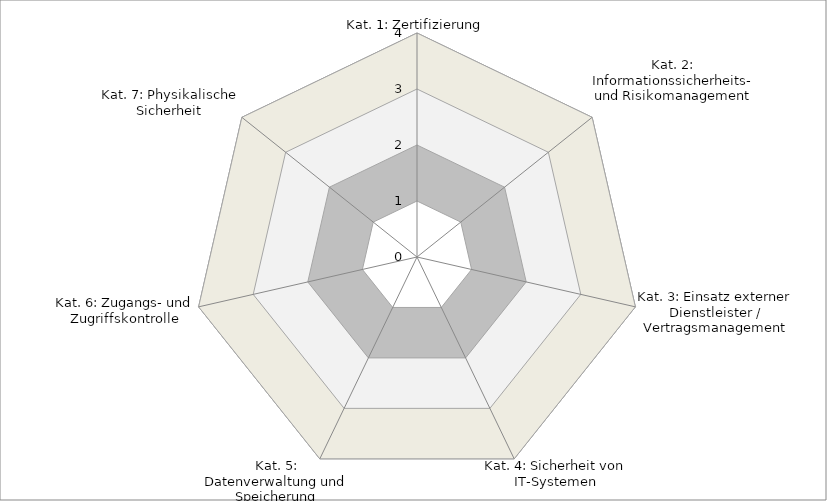
| Category | Max | Soll | Min | Null | Ist |
|---|---|---|---|---|---|
| Kat. 1: Zertifizierung | 4 | 3 | 2 | 1 | 0 |
| Kat. 2: Informationssicherheits- und Risikomanagement | 4 | 3 | 2 | 1 | 0 |
| Kat. 3: Einsatz externer Dienstleister / Vertragsmanagement | 4 | 3 | 2 | 1 | 0 |
| Kat. 4: Sicherheit von IT-Systemen | 4 | 3 | 2 | 1 | 0 |
| Kat. 5: Datenverwaltung und Speicherung | 4 | 3 | 2 | 1 | 0 |
| Kat. 6: Zugangs- und Zugriffskontrolle | 4 | 3 | 2 | 1 | 0 |
| Kat. 7: Physikalische Sicherheit | 4 | 3 | 2 | 1 | 0 |